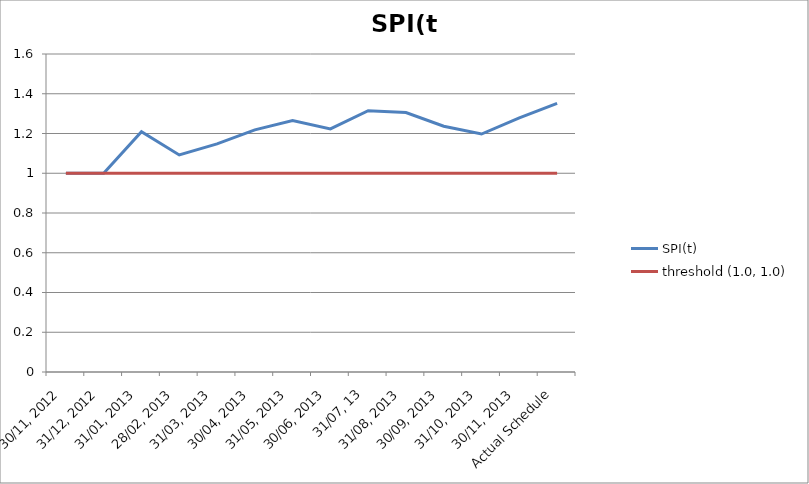
| Category | SPI(t) | threshold (1.0, 1.0) |
|---|---|---|
| 30/11, 2012 | 1 | 1 |
| 31/12, 2012 | 1 | 1 |
| 31/01, 2013 | 1.209 | 1 |
| 28/02, 2013 | 1.092 | 1 |
| 31/03, 2013 | 1.147 | 1 |
| 30/04, 2013 | 1.218 | 1 |
| 31/05, 2013 | 1.265 | 1 |
| 30/06, 2013 | 1.223 | 1 |
| 31/07, 13 | 1.315 | 1 |
| 31/08, 2013 | 1.306 | 1 |
| 30/09, 2013 | 1.237 | 1 |
| 31/10, 2013 | 1.197 | 1 |
| 30/11, 2013 | 1.278 | 1 |
| Actual Schedule | 1.352 | 1 |